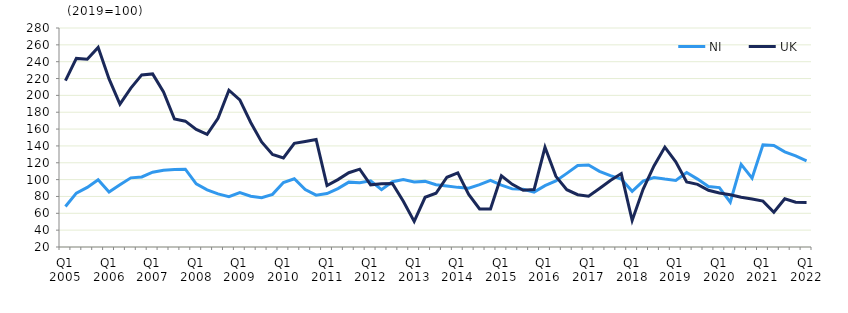
| Category | NI | UK  |
|---|---|---|
| Q1 2005 | 68 | 217.6 |
|  | 83.9 | 243.9 |
| Q3 2005 | 90.7 | 243 |
|  | 99.9 | 257 |
| Q1 2006 | 85.3 | 219.5 |
|  | 93.9 | 189.6 |
| Q3 2006 | 102.1 | 208.6 |
|  | 103.2 | 224.3 |
| Q1 2007 | 108.8 | 225.5 |
|  | 111.1 | 204 |
| Q3 2007 | 112 | 172 |
|  | 112.4 | 169.4 |
| Q1 2008 | 94.9 | 159.7 |
|  | 87.9 | 153.8 |
| Q3 2008 | 83 | 172.7 |
|  | 79.8 | 206.1 |
| Q1 2009 | 84.5 | 194.7 |
|  | 80.3 | 167.8 |
| Q3 2009 | 78.6 | 144.8 |
|  | 82.5 | 129.8 |
| Q1 2010 | 96.6 | 125.8 |
|  | 101 | 143 |
| Q3 2010 | 88.3 | 145.3 |
|  | 81.5 | 147.7 |
| Q1 2011 | 83.5 | 92.9 |
|  | 89.4 | 100 |
| Q3 2011 | 97 | 108.2 |
|  | 96.4 | 112.4 |
| Q1 2012 | 98.5 | 93.8 |
|  | 88 | 95 |
| Q3 2012 | 97.5 | 95.4 |
|  | 100 | 74.3 |
| Q1 2013 | 97.2 | 50.4 |
|  | 97.9 | 79 |
| Q3 2013 | 94 | 83.8 |
|  | 92.4 | 102.8 |
| Q1 2014 | 90.8 | 108 |
|  | 89.9 | 82.5 |
| Q3 2014 | 94 | 65.2 |
|  | 99.1 | 65.1 |
| Q1 2015 | 93.4 | 104.6 |
|  | 89 | 94.4 |
| Q3 2015 | 88.5 | 87.3 |
|  | 85.2 | 88.2 |
| Q1 2016 | 92.9 | 138.4 |
|  | 98.4 | 103.9 |
| Q3 2016 | 107.4 | 88 |
|  | 116.7 | 82.1 |
| Q1 2017 | 117.4 | 80.3 |
|  | 109.8 | 89.5 |
| Q3 2017 | 104.8 | 99 |
|  | 100.6 | 107.2 |
| Q1 2018 | 86.2 | 51.5 |
|  | 98.2 | 88.5 |
| Q3 2018 | 102.4 | 116.2 |
|  | 100.6 | 138.6 |
| Q1 2019 | 99.1 | 121.2 |
|  | 108.5 | 97.2 |
| Q3 2019 | 100.6 | 94.4 |
|  | 91.7 | 87.3 |
| Q1 2020 | 90.5 | 84.1 |
|  | 73.3 | 82 |
| Q3 2020 | 118.1 | 79.1 |
|  | 101.8 | 77 |
| Q1 2021 | 141.3 | 74.5 |
|  | 140.5 | 61.2 |
| Q3 2021 | 133 | 77.2 |
|  | 128.2 | 73.1 |
| Q1 2022 | 122.3 | 72.9 |